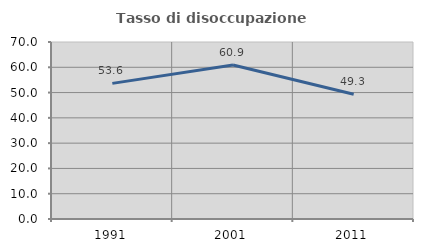
| Category | Tasso di disoccupazione giovanile  |
|---|---|
| 1991.0 | 53.643 |
| 2001.0 | 60.901 |
| 2011.0 | 49.324 |